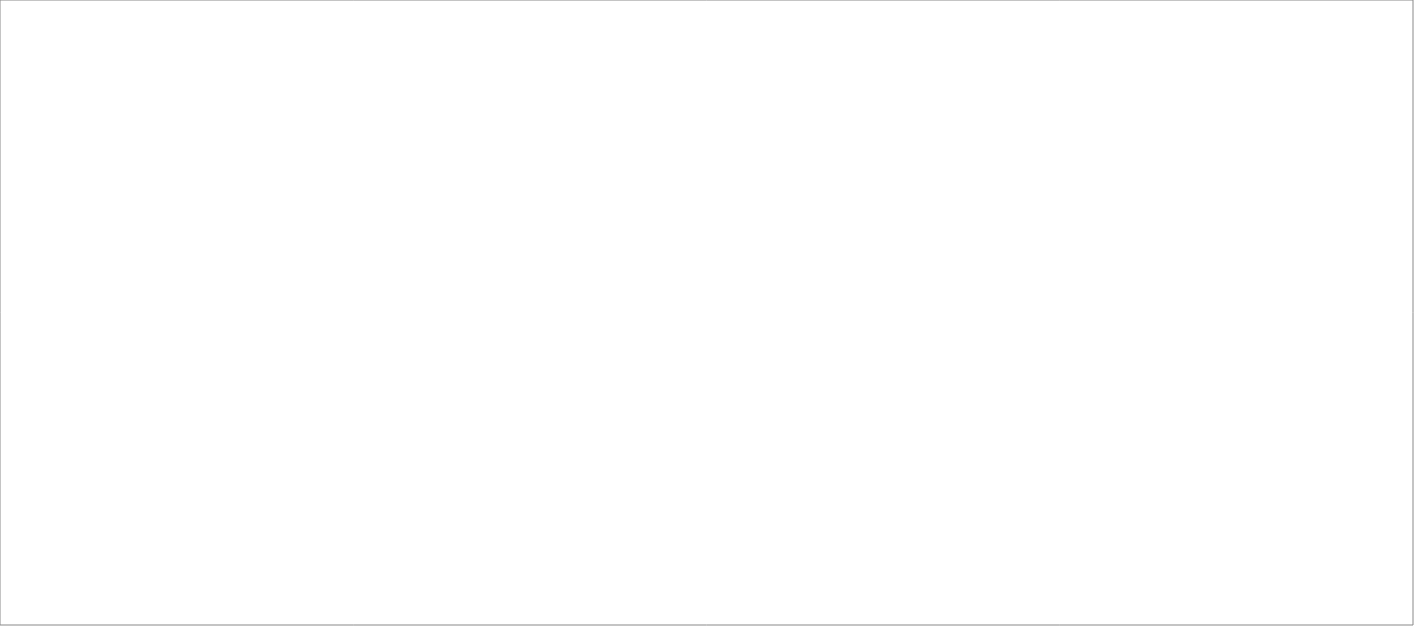
| Category | Total |
|---|---|
| Poolia Sverige AB | 85 |
| Clockwork Bemanning & Rekrytering AB | 85 |
| Randstad AB | 80 |
| Signpost AB | 45 |
| Experis AB | 45 |